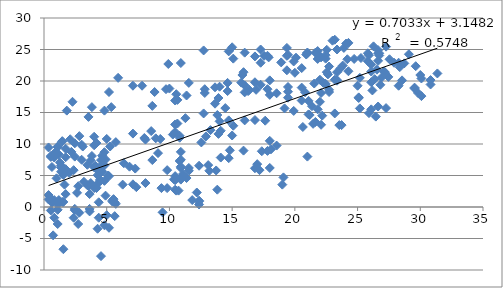
| Category | Series 0 |
|---|---|
| 2.4545454545454546 | -0.5 |
| 5.181818181818182 | -3.3 |
| 1.0909090909090908 | -2.7 |
| 4.818181818181818 | -2.9 |
| 4.2727272727272725 | -3.45 |
| 0.5454545454545454 | -0.55 |
| 1.0909090909090908 | 0.4 |
| 0.8181818181818182 | 1.1 |
| 5.0 | -1.3 |
| 5.636363636363637 | -1.45 |
| 5.7272727272727275 | 0.5 |
| 5.545454545454546 | 1.25 |
| 5.636363636363637 | 0.75 |
| 4.181818181818182 | 3 |
| 1.7272727272727273 | 2.05 |
| 5.454545454545454 | 0.85 |
| 5.454545454545454 | 1.05 |
| 0.36363636363636365 | 1.2 |
| 1.4545454545454546 | 0.8 |
| 0.5454545454545454 | 1.35 |
| 4.454545454545454 | 4.3 |
| 7.090909090909091 | 3.6 |
| 1.5454545454545454 | 0.8 |
| 2.4545454545454546 | -0.3 |
| 6.2727272727272725 | 3.55 |
| 4.545454545454546 | 4.2 |
| 4.0 | 3 |
| 4.2727272727272725 | 3.7 |
| 8.090909090909092 | 3.8 |
| 7.363636363636363 | 3.15 |
| 1.0909090909090908 | -0.45 |
| 1.1818181818181819 | 0.7 |
| 0.6363636363636364 | 0.7 |
| 3.4545454545454546 | 3.45 |
| 4.818181818181818 | 4.15 |
| 2.0 | 5.4 |
| 0.6363636363636364 | 6.35 |
| 1.7272727272727273 | 6 |
| 9.818181818181818 | 5.85 |
| 10.454545454545455 | 4.9 |
| 3.5454545454545454 | 3.35 |
| 10.363636363636363 | 4.4 |
| 9.363636363636363 | 3 |
| 12.181818181818182 | 2.3 |
| 12.363636363636363 | 0.9 |
| 12.363636363636363 | 0.4 |
| 10.727272727272727 | 2.6 |
| 10.454545454545455 | 2.75 |
| 12.363636363636363 | 1 |
| 9.454545454545455 | -0.85 |
| 11.818181818181818 | 1.1 |
| 11.363636363636363 | 4.6 |
| 9.818181818181818 | 3 |
| 10.545454545454545 | 2.6 |
| 13.818181818181818 | 2.75 |
| 10.909090909090908 | 4.35 |
| 10.454545454545455 | 4.25 |
| 11.090909090909092 | 5.25 |
| 11.545454545454545 | 6.2 |
| 3.0 | 7.5 |
| 3.727272727272727 | 7.4 |
| 1.3636363636363635 | 6.6 |
| 1.3636363636363635 | 6.25 |
| 1.3636363636363635 | 5.6 |
| 10.909090909090908 | 7.5 |
| 10.909090909090908 | 8.75 |
| 10.909090909090908 | 6.4 |
| 10.909090909090908 | 6.2 |
| 10.909090909090908 | 4.65 |
| 18.0 | 6.2 |
| 17.181818181818183 | 5.85 |
| 17.363636363636363 | 8.85 |
| 14.090909090909092 | 7.85 |
| 14.818181818181818 | 9 |
| 18.09090909090909 | 9.15 |
| 15.909090909090908 | 8.95 |
| 18.545454545454547 | 9.75 |
| 17.818181818181817 | 8.9 |
| 13.181818181818182 | 5.75 |
| 19.0 | 3.55 |
| 19.09090909090909 | 4.7 |
| 18.0 | 10.5 |
| 17.0 | 6.8 |
| 16.818181818181817 | 6.15 |
| 21.0 | 8 |
| 9.090909090909092 | 8.55 |
| 1.0909090909090908 | 9.6 |
| 2.4545454545454546 | 8 |
| 10.818181818181818 | 11 |
| 14.090909090909092 | 12.1 |
| 10.272727272727273 | 11.5 |
| 4.0 | 11.15 |
| 16.818181818181817 | 13.8 |
| 12.909090909090908 | 11.2 |
| 11.272727272727273 | 14.1 |
| 21.636363636363637 | 13.5 |
| 21.454545454545453 | 13.2 |
| 15.090909090909092 | 12.9 |
| 22.09090909090909 | 13.05 |
| 17.636363636363637 | 13.7 |
| 13.818181818181818 | 14.6 |
| 14.727272727272727 | 13.75 |
| 22.181818181818183 | 14.5 |
| 23.181818181818183 | 14.85 |
| 21.181818181818183 | 14.6 |
| 1.7272727272727273 | 9.25 |
| 13.272727272727273 | 12.2 |
| 13.909090909090908 | 11.6 |
| 8.545454545454545 | 12.05 |
| 10.454545454545455 | 13.1 |
| 16.0 | 13.75 |
| 25.181818181818183 | 15.65 |
| 25.90909090909091 | 14.9 |
| 9.272727272727273 | 10.8 |
| 20.636363636363637 | 12.7 |
| 2.4545454545454546 | 10.1 |
| 1.4545454545454546 | 10.45 |
| 3.0 | 9.9 |
| 12.545454545454545 | 10.25 |
| 23.727272727272727 | 13 |
| 26.454545454545453 | 14.35 |
| 26.636363636363637 | 15.95 |
| 26.09090909090909 | 15.5 |
| 19.181818181818183 | 15.65 |
| 23.545454545454547 | 13 |
| 21.818181818181817 | 15.5 |
| 27.272727272727273 | 15.7 |
| 21.363636363636363 | 16 |
| 20.545454545454547 | 16.9 |
| 19.454545454545453 | 18.3 |
| 25.09090909090909 | 17.4 |
| 22.727272727272727 | 18.25 |
| 18.545454545454547 | 18.05 |
| 18.0 | 17.8 |
| 5.363636363636363 | 15.85 |
| 20.818181818181817 | 18.2 |
| 20.545454545454547 | 18.95 |
| 23.363636363636363 | 20.05 |
| 26.09090909090909 | 19.8 |
| 27.454545454545453 | 20.65 |
| 22.545454545454547 | 21.4 |
| 26.09090909090909 | 21.5 |
| 26.09090909090909 | 22.6 |
| 26.636363636363637 | 24.4 |
| 27.272727272727273 | 25.45 |
| 21.818181818181817 | 23.5 |
| 31.363636363636363 | 21.2 |
| 29.545454545454547 | 18.8 |
| 28.545454545454547 | 20.1 |
| 19.90909090909091 | 15.25 |
| 21.09090909090909 | 14.7 |
| 25.09090909090909 | 17.3 |
| 29.545454545454547 | 18.95 |
| 30.09090909090909 | 20.4 |
| 28.272727272727273 | 19.25 |
| 11.545454545454545 | 19.7 |
| 7.818181818181818 | 19.25 |
| 22.727272727272727 | 18.6 |
| 10.545454545454545 | 17.9 |
| 10.454545454545455 | 16.9 |
| 25.0 | 19.25 |
| 25.181818181818183 | 20.5 |
| 30.818181818181817 | 19.45 |
| 30.0 | 20.95 |
| 28.272727272727273 | 22.9 |
| 17.545454545454547 | 24 |
| 27.545454545454547 | 23.45 |
| 15.818181818181818 | 20.95 |
| 28.363636363636363 | 22.2 |
| 20.90909090909091 | 24.2 |
| 23.363636363636363 | 20.15 |
| 22.09090909090909 | 18.1 |
| 30.09090909090909 | 17.6 |
| 21.545454545454547 | 19.6 |
| 22.454545454545453 | 19.55 |
| 27.09090909090909 | 21.5 |
| 15.909090909090908 | 21.4 |
| 24.272727272727273 | 21.55 |
| 27.90909090909091 | 22.9 |
| 24.181818181818183 | 23.45 |
| 25.90909090909091 | 24.1 |
| 22.09090909090909 | 23.75 |
| 26.636363636363637 | 23.2 |
| 29.09090909090909 | 24.25 |
| 26.636363636363637 | 24.9 |
| 26.727272727272727 | 24.05 |
| 28.727272727272727 | 22.8 |
| 18.0 | 20.1 |
| 30.818181818181817 | 20.15 |
| 26.818181818181817 | 19.4 |
| 22.272727272727273 | 19.7 |
| 26.363636363636363 | 20.3 |
| 22.636363636363637 | 21.05 |
| 22.727272727272727 | 22.3 |
| 19.363636363636363 | 25.25 |
| 17.272727272727273 | 25 |
| 26.272727272727273 | 25.5 |
| 12.727272727272727 | 24.85 |
| 26.181818181818183 | 18.5 |
| 29.818181818181817 | 18.1 |
| 26.90909090909091 | 20.55 |
| 23.636363636363637 | 22 |
| 17.90909090909091 | 23.75 |
| 25.272727272727273 | 23.65 |
| 22.0 | 23.95 |
| 29.636363636363637 | 22.35 |
| 23.363636363636363 | 21.4 |
| 23.818181818181817 | 22.45 |
| 26.727272727272727 | 24.4 |
| 25.818181818181817 | 24.4 |
| 23.363636363636363 | 25 |
| 14.727272727272727 | 24.7 |
| 23.90909090909091 | 25.25 |
| 17.818181818181817 | 24 |
| 5.181818181818182 | 18.25 |
| 27.181818181818183 | 21.4 |
| 26.545454545454547 | 21.8 |
| 24.727272727272727 | 23.5 |
| 21.818181818181817 | 24.75 |
| 15.090909090909092 | 23.55 |
| 20.09090909090909 | 23.7 |
| 19.363636363636363 | 21.7 |
| 25.818181818181817 | 23.15 |
| 22.454545454545453 | 23.55 |
| 22.454545454545453 | 24.1 |
| 16.818181818181817 | 23.9 |
| 21.0 | 24.5 |
| 22.545454545454547 | 24.95 |
| 24.09090909090909 | 25.95 |
| 24.272727272727273 | 26.05 |
| 23.181818181818183 | 26.55 |
| 23.0 | 26.4 |
| 15.0 | 25.35 |
| 21.0 | 24.5 |
| 19.363636363636363 | 24 |
| 18.90909090909091 | 22.95 |
| 19.90909090909091 | 23.1 |
| 16.0 | 24.5 |
| 21.636363636363637 | 24.5 |
| 21.0 | 24.4 |
| 19.454545454545453 | 24.15 |
| 9.727272727272727 | 18.7 |
| 22.0 | 20.2 |
| 20.545454545454547 | 22.05 |
| 17.272727272727273 | 22.9 |
| 9.909090909090908 | 22.7 |
| 10.909090909090908 | 22.85 |
| 23.181818181818183 | 20.2 |
| 22.0 | 16.7 |
| 21.09090909090909 | 16.85 |
| 19.454545454545453 | 17.35 |
| 12.818181818181818 | 18.7 |
| 19.454545454545453 | 19.05 |
| 20.0 | 21.3 |
| 15.727272727272727 | 19.75 |
| 17.818181818181817 | 18.7 |
| 8.636363636363637 | 16.05 |
| 3.5454545454545454 | 14.3 |
| 1.8181818181818181 | 15.3 |
| 17.272727272727273 | 19.4 |
| 16.363636363636363 | 18.6 |
| 8.818181818181818 | 18.25 |
| 16.90909090909091 | 18.6 |
| 13.636363636363637 | 19 |
| 16.0 | 19.3 |
| 16.818181818181817 | 19.8 |
| 14.636363636363637 | 19.7 |
| 5.909090909090909 | 20.5 |
| 10.0 | 18.8 |
| 14.636363636363637 | 18.4 |
| 16.0 | 18.2 |
| 16.272727272727273 | 18.4 |
| 11.363636363636363 | 17.7 |
| 14.0 | 19.1 |
| 13.909090909090908 | 17.3 |
| 13.636363636363637 | 16.4 |
| 14.454545454545455 | 15.7 |
| 4.818181818181818 | 15.3 |
| 3.8181818181818183 | 15.85 |
| 12.818181818181818 | 18.1 |
| 7.090909090909091 | 19.25 |
| 2.272727272727273 | 16.7 |
| 10.636363636363637 | 17 |
| 12.727272727272727 | 14.85 |
| 14.0 | 13.6 |
| 15.0 | 11.35 |
| 14.727272727272727 | 7.75 |
| 13.727272727272727 | 5.8 |
| 12.363636363636363 | 6.55 |
| 10.818181818181818 | 7.3 |
| 13.090909090909092 | 6.65 |
| 11.545454545454545 | 5.75 |
| 4.909090909090909 | 7.55 |
| 2.1818181818181817 | 8.75 |
| 4.0 | 9.8 |
| 5.0 | 10.8 |
| 10.818181818181818 | 11.3 |
| 10.636363636363637 | 13.25 |
| 10.454545454545455 | 11.9 |
| 8.909090909090908 | 10.9 |
| 8.0 | 10.95 |
| 7.090909090909091 | 11.65 |
| 8.090909090909092 | 10.7 |
| 3.090909090909091 | 9.6 |
| 5.7272727272727275 | 10.3 |
| 0.8181818181818182 | 7.85 |
| 8.636363636363637 | 7.45 |
| 3.4545454545454546 | 6.7 |
| 2.3636363636363638 | 5.85 |
| 4.545454545454546 | 6.3 |
| 4.636363636363637 | 5.65 |
| 1.2727272727272727 | 7.05 |
| 4.090909090909091 | 6.55 |
| 6.363636363636363 | 6.95 |
| 7.2727272727272725 | 6.1 |
| 6.818181818181818 | 6.4 |
| 4.545454545454546 | 6.45 |
| 0.9090909090909091 | 8.7 |
| 1.0909090909090908 | 9.5 |
| 1.4545454545454546 | 10.4 |
| 2.090909090909091 | 10.75 |
| 4.181818181818182 | 10.15 |
| 2.8181818181818183 | 11.25 |
| 4.818181818181818 | 8.7 |
| 4.0 | 6.3 |
| 1.1818181818181819 | 8.35 |
| 5.2727272727272725 | 9.6 |
| 4.545454545454546 | 7.45 |
| 4.363636363636363 | 6.2 |
| 0.5454545454545454 | 7.95 |
| 1.7272727272727273 | 7.9 |
| 3.8181818181818183 | 8.1 |
| 0.5454545454545454 | 8.1 |
| 0.36363636363636365 | 9.45 |
| 4.181818181818182 | 6.1 |
| 5.181818181818182 | 4.9 |
| 4.181818181818182 | 3.1 |
| 1.6363636363636365 | 3.55 |
| 5.090909090909091 | 5 |
| 3.1818181818181817 | 4 |
| 1.0 | 4.55 |
| 4.636363636363637 | 8.15 |
| 4.818181818181818 | 6.6 |
| 4.2727272727272725 | 5.05 |
| 4.363636363636363 | 5.65 |
| 3.727272727272727 | 3.8 |
| 2.727272727272727 | 3.3 |
| 3.6363636363636362 | -0.3 |
| 2.3636363636363638 | -1.7 |
| 4.363636363636363 | -1.7 |
| 3.6363636363636362 | -0.7 |
| 2.727272727272727 | -2.7 |
| 1.5454545454545454 | -6.7 |
| 4.545454545454546 | -7.8 |
| 0.7272727272727273 | -4.5 |
| 0.8181818181818182 | -1.7 |
| 2.6363636363636362 | 2.25 |
| 0.36363636363636365 | 1.9 |
| 1.5454545454545454 | 5.1 |
| 3.6363636363636362 | 2.05 |
| 4.909090909090909 | 1.8 |
| 2.8181818181818183 | -0.9 |
| 4.363636363636363 | 0.75 |
| 1.1818181818181819 | 1.1 |
| 0.6363636363636364 | 1.1 |